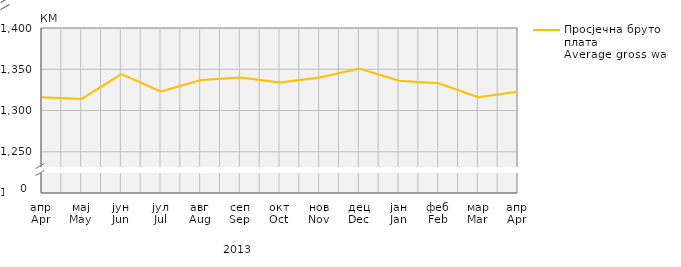
| Category | Просјечна бруто плата
Average gross wage |
|---|---|
| апр
Apr | 1316 |
| мај
May | 1314 |
| јун
Jun | 1344 |
| јул
Jul | 1323 |
| авг
Aug | 1337 |
| сеп
Sep | 1340 |
| окт
Oct | 1334 |
| нов
Nov | 1340 |
| дец
Dec | 1351 |
| јан
Jan | 1336 |
| феб
Feb | 1333 |
| мар
Mar | 1316 |
| апр
Apr | 1323 |